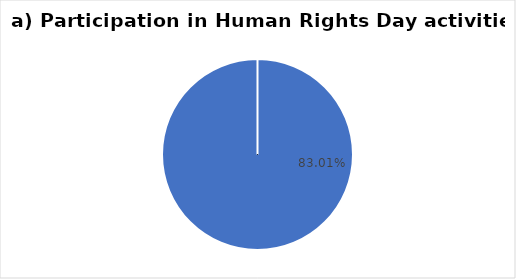
| Category | a) Human Rights Day |
|---|---|
| 0 | 0.83 |